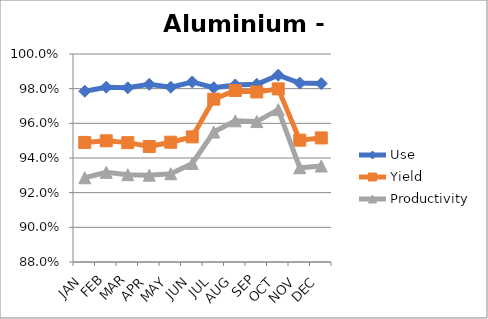
| Category | Use | Yield | Productivity |
|---|---|---|---|
| JAN | 0.979 | 0.949 | 0.929 |
| FEB | 0.981 | 0.95 | 0.932 |
| MAR | 0.981 | 0.949 | 0.93 |
| APR | 0.983 | 0.947 | 0.93 |
| MAY | 0.981 | 0.949 | 0.931 |
| JUN | 0.984 | 0.952 | 0.937 |
| JUL | 0.981 | 0.974 | 0.955 |
| AUG | 0.982 | 0.979 | 0.961 |
| SEP | 0.983 | 0.978 | 0.961 |
| OCT | 0.988 | 0.98 | 0.968 |
| NOV | 0.983 | 0.95 | 0.934 |
| DEC | 0.983 | 0.952 | 0.935 |